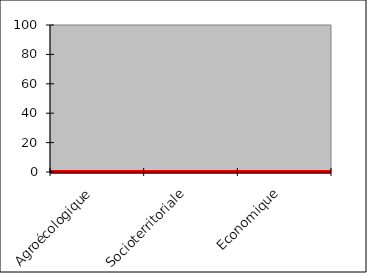
| Category | Series 1 |
|---|---|
| Agroécologique | 0 |
| Socioterritoriale | 0 |
| Economique | 0 |